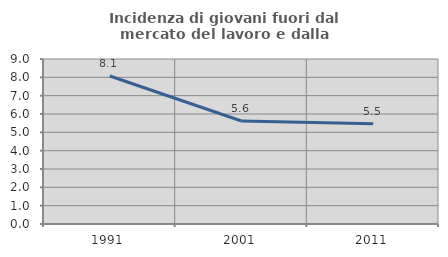
| Category | Incidenza di giovani fuori dal mercato del lavoro e dalla formazione  |
|---|---|
| 1991.0 | 8.074 |
| 2001.0 | 5.619 |
| 2011.0 | 5.472 |